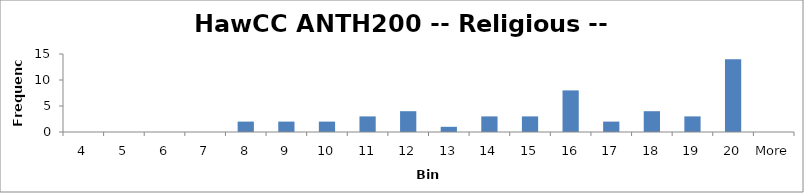
| Category | Frequency |
|---|---|
| 4 | 0 |
| 5 | 0 |
| 6 | 0 |
| 7 | 0 |
| 8 | 2 |
| 9 | 2 |
| 10 | 2 |
| 11 | 3 |
| 12 | 4 |
| 13 | 1 |
| 14 | 3 |
| 15 | 3 |
| 16 | 8 |
| 17 | 2 |
| 18 | 4 |
| 19 | 3 |
| 20 | 14 |
| More | 0 |